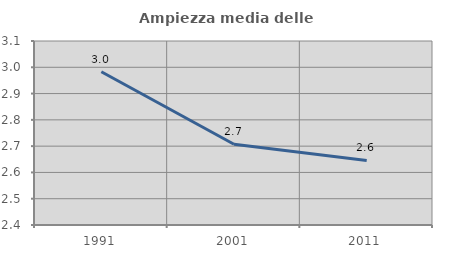
| Category | Ampiezza media delle famiglie |
|---|---|
| 1991.0 | 2.983 |
| 2001.0 | 2.707 |
| 2011.0 | 2.646 |